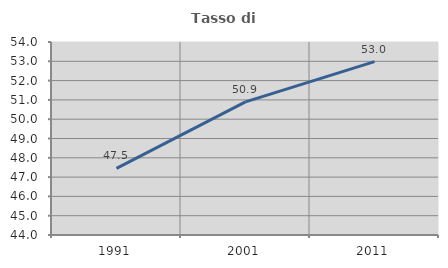
| Category | Tasso di occupazione   |
|---|---|
| 1991.0 | 47.454 |
| 2001.0 | 50.896 |
| 2011.0 | 52.982 |